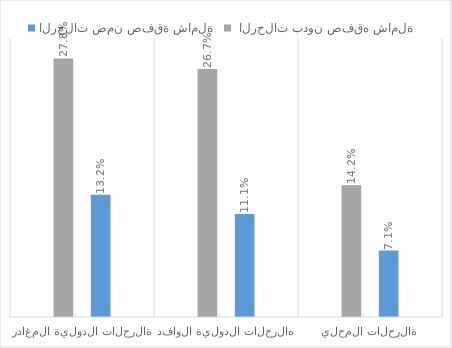
| Category | الرحلات ضمن صفقة شاملة |  الرحلات بدون صفقه شاملة  |
|---|---|---|
| الرحلات المحلية  | 0.071 | 0.142 |
| الرحلات الدولية الوافده  | 0.111 | 0.267 |
| الرحلات الدولية المغادرة  | 0.132 | 0.278 |